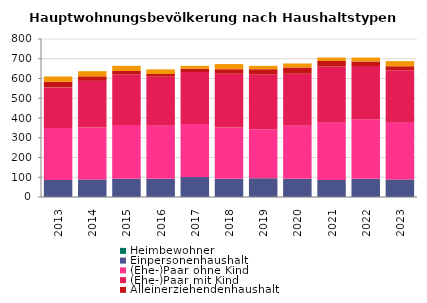
| Category | Heimbewohner | Einpersonenhaushalt | (Ehe-)Paar ohne Kind | (Ehe-)Paar mit Kind | Alleinerziehendenhaushalt | sonstiger Mehrpersonenhaushalt |
|---|---|---|---|---|---|---|
| 2013.0 | 0 | 86 | 263 | 206 | 29 | 26 |
| 2014.0 | 0 | 89 | 263 | 236 | 23 | 26 |
| 2015.0 | 0 | 92 | 272 | 257 | 17 | 26 |
| 2016.0 | 0 | 92 | 269 | 248 | 14 | 23 |
| 2017.0 | 0 | 101 | 269 | 263 | 17 | 14 |
| 2018.0 | 0 | 92 | 260 | 272 | 23 | 26 |
| 2019.0 | 0 | 95 | 248 | 278 | 26 | 17 |
| 2020.0 | 0 | 92 | 269 | 263 | 32 | 20 |
| 2021.0 | 0 | 86 | 290 | 284 | 29 | 17 |
| 2022.0 | 0 | 92 | 302 | 269 | 23 | 20 |
| 2023.0 | 0 | 89 | 287 | 266 | 20 | 26 |